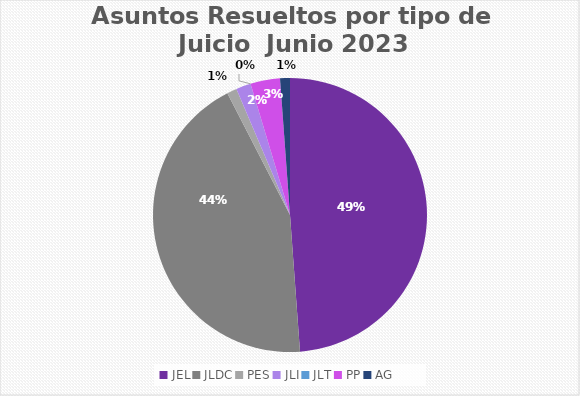
| Category | Asuntos Resueltos por tipo de Juicio  JUNIO |
|---|---|
| JEL | 84 |
| JLDC | 75 |
| PES | 2 |
| JLI | 3 |
| JLT | 0 |
| PP | 6 |
| AG | 2 |